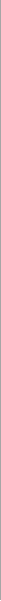
| Category | Precipitazioni |
|---|---|
| 0 | 1 |